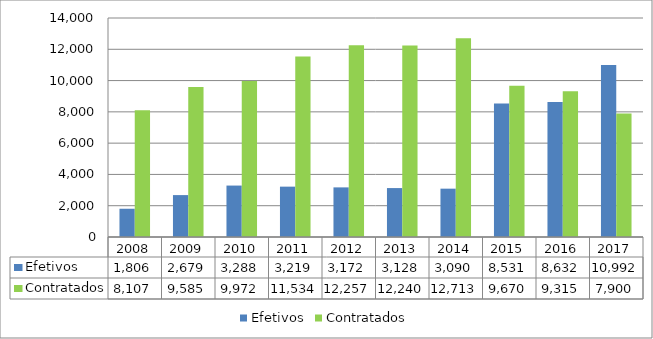
| Category | Efetivos | Contratados |
|---|---|---|
| 2008.0 | 1806 | 8107 |
| 2009.0 | 2679 | 9585 |
| 2010.0 | 3288 | 9972 |
| 2011.0 | 3219 | 11534 |
| 2012.0 | 3172 | 12257 |
| 2013.0 | 3128 | 12240 |
| 2014.0 | 3090 | 12713 |
| 2015.0 | 8531 | 9670 |
| 2016.0 | 8632 | 9315 |
| 2017.0 | 10992 | 7900 |